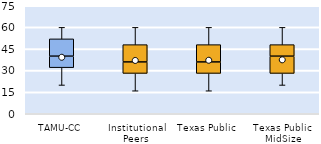
| Category | 25th | 50th | 75th |
|---|---|---|---|
| TAMU-CC | 32 | 8 | 12 |
| Institutional Peers | 28 | 8 | 12 |
| Texas Public | 28 | 8 | 12 |
| Texas Public MidSize | 28 | 12 | 8 |